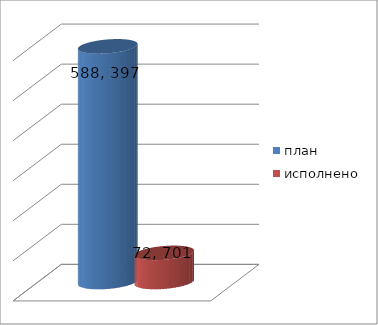
| Category | план | исполнено |
|---|---|---|
| 0 | 588397190 | 72701610.46 |